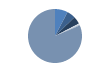
| Category | Series 0 |
|---|---|
| ARRASTRE | 78 |
| CERCO | 52 |
| PALANGRE | 46 |
| REDES DE ENMALLE | 7 |
| ARTES FIJAS | 5 |
| ARTES MENORES | 825 |